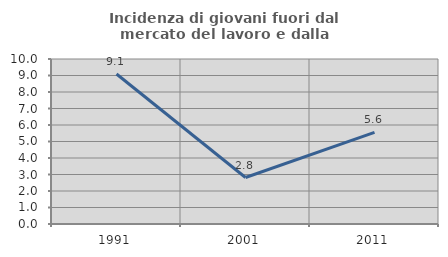
| Category | Incidenza di giovani fuori dal mercato del lavoro e dalla formazione  |
|---|---|
| 1991.0 | 9.091 |
| 2001.0 | 2.817 |
| 2011.0 | 5.556 |